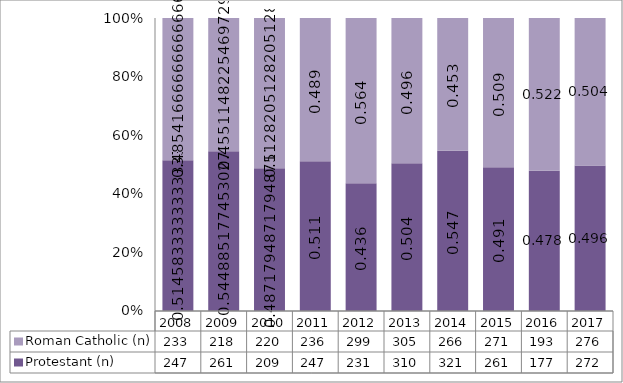
| Category | Protestant (n) | Roman Catholic (n) |
|---|---|---|
| 2008.0 | 247 | 233 |
| 2009.0 | 261 | 218 |
| 2010.0 | 209 | 220 |
| 2011.0 | 247 | 236 |
| 2012.0 | 231 | 299 |
| 2013.0 | 310 | 305 |
| 2014.0 | 321 | 266 |
| 2015.0 | 261 | 271 |
| 2016.0 | 177 | 193 |
| 2017.0 | 272 | 276 |